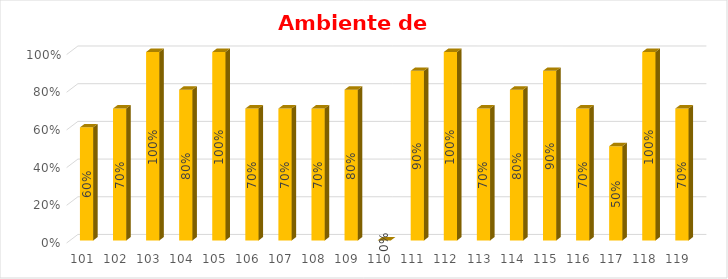
| Category | % Avance |
|---|---|
| 101.0 | 0.6 |
| 102.0 | 0.7 |
| 103.0 | 1 |
| 104.0 | 0.8 |
| 105.0 | 1 |
| 106.0 | 0.7 |
| 107.0 | 0.7 |
| 108.0 | 0.7 |
| 109.0 | 0.8 |
| 110.0 | 0 |
| 111.0 | 0.9 |
| 112.0 | 1 |
| 113.0 | 0.7 |
| 114.0 | 0.8 |
| 115.0 | 0.9 |
| 116.0 | 0.7 |
| 117.0 | 0.5 |
| 118.0 | 1 |
| 119.0 | 0.7 |